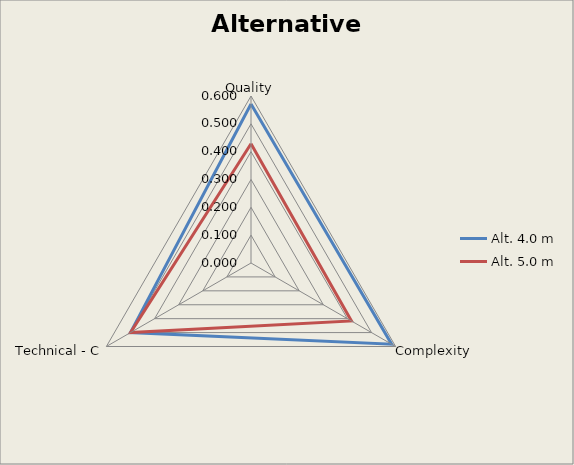
| Category | Alt. 4.0 m | Alt. 5.0 m |
|---|---|---|
| Quality | 0.571 | 0.429 |
| Complexity | 0.583 | 0.417 |
| Technical - C | 0.5 | 0.5 |